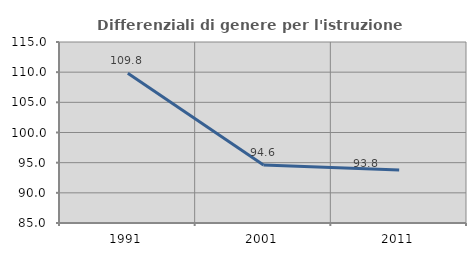
| Category | Differenziali di genere per l'istruzione superiore |
|---|---|
| 1991.0 | 109.825 |
| 2001.0 | 94.626 |
| 2011.0 | 93.775 |